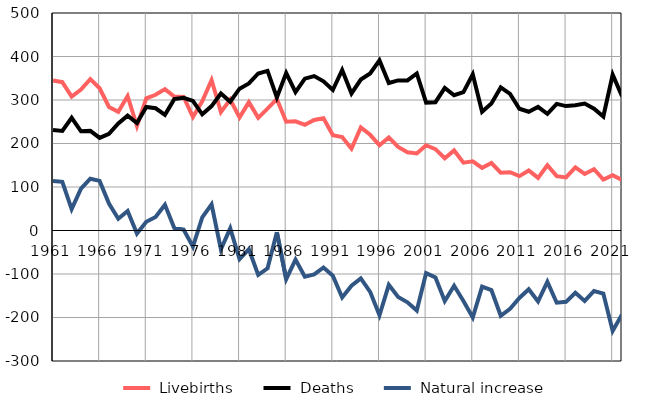
| Category |  Livebirths |  Deaths |  Natural increase |
|---|---|---|---|
| 1961.0 | 345 | 231 | 114 |
| 1962.0 | 341 | 229 | 112 |
| 1963.0 | 308 | 259 | 49 |
| 1964.0 | 324 | 228 | 96 |
| 1965.0 | 348 | 229 | 119 |
| 1966.0 | 327 | 213 | 114 |
| 1967.0 | 284 | 222 | 62 |
| 1968.0 | 273 | 246 | 27 |
| 1969.0 | 309 | 264 | 45 |
| 1970.0 | 240 | 247 | -7 |
| 1971.0 | 304 | 284 | 20 |
| 1972.0 | 312 | 281 | 31 |
| 1973.0 | 325 | 266 | 59 |
| 1974.0 | 308 | 302 | 6 |
| 1975.0 | 307 | 305 | 2 |
| 1976.0 | 261 | 298 | -37 |
| 1977.0 | 297 | 267 | 30 |
| 1978.0 | 346 | 286 | 60 |
| 1979.0 | 272 | 315 | -43 |
| 1980.0 | 301 | 296 | 5 |
| 1981.0 | 260 | 326 | -66 |
| 1982.0 | 295 | 338 | -43 |
| 1983.0 | 259 | 361 | -102 |
| 1984.0 | 280 | 367 | -87 |
| 1985.0 | 302 | 306 | -4 |
| 1986.0 | 250 | 362 | -112 |
| 1987.0 | 251 | 318 | -67 |
| 1988.0 | 243 | 349 | -106 |
| 1989.0 | 254 | 355 | -101 |
| 1990.0 | 258 | 343 | -85 |
| 1991.0 | 219 | 323 | -104 |
| 1992.0 | 215 | 369 | -154 |
| 1993.0 | 188 | 315 | -127 |
| 1994.0 | 237 | 347 | -110 |
| 1995.0 | 220 | 361 | -141 |
| 1996.0 | 196 | 391 | -195 |
| 1997.0 | 214 | 339 | -125 |
| 1998.0 | 192 | 345 | -153 |
| 1999.0 | 180 | 345 | -165 |
| 2000.0 | 177 | 361 | -184 |
| 2001.0 | 196 | 294 | -98 |
| 2002.0 | 187 | 295 | -108 |
| 2003.0 | 166 | 328 | -162 |
| 2004.0 | 184 | 311 | -127 |
| 2005.0 | 156 | 318 | -162 |
| 2006.0 | 159 | 359 | -200 |
| 2007.0 | 144 | 273 | -129 |
| 2008.0 | 155 | 292 | -137 |
| 2009.0 | 133 | 329 | -196 |
| 2010.0 | 134 | 314 | -180 |
| 2011.0 | 125 | 280 | -155 |
| 2012.0 | 138 | 273 | -135 |
| 2013.0 | 121 | 284 | -163 |
| 2014.0 | 150 | 268 | -118 |
| 2015.0 | 125 | 291 | -166 |
| 2016.0 | 122 | 286 | -164 |
| 2017.0 | 145 | 288 | -143 |
| 2018.0 | 130 | 292 | -162 |
| 2019.0 | 141 | 280 | -139 |
| 2020.0 | 117 | 262 | -145 |
| 2021.0 | 127 | 358 | -231 |
| 2022.0 | 116 | 309 | -193 |